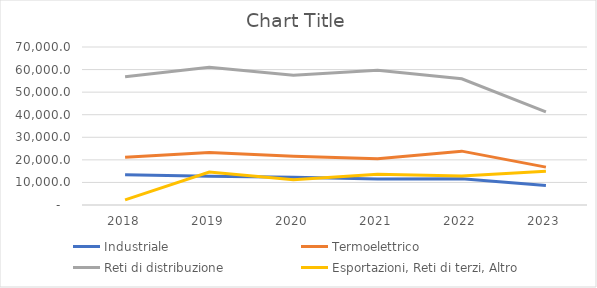
| Category | Industriale | Termoelettrico | Reti di distribuzione | Esportazioni, Reti di terzi, Altro |
|---|---|---|---|---|
| 2018.0 | 13447.884 | 21167.009 | 56795.311 | 2265.152 |
| 2019.0 | 12735.753 | 23288.058 | 61004.997 | 14630.752 |
| 2020.0 | 12275.182 | 21611.519 | 57461.291 | 11200.297 |
| 2021.0 | 11535.46 | 20527.923 | 59746.632 | 13626.368 |
| 2022.0 | 11662.148 | 23857.866 | 55895.391 | 12878.829 |
| 2023.0 | 8616.871 | 16785.236 | 41290.331 | 15005.091 |